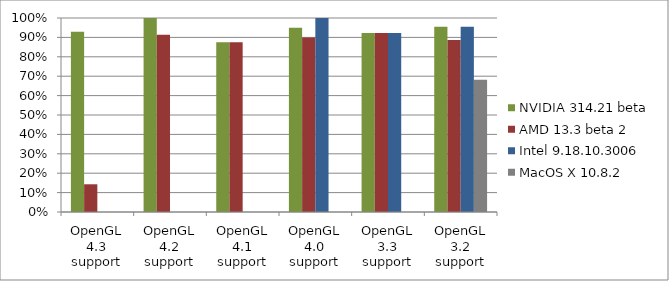
| Category | NVIDIA 314.21 beta | AMD 13.3 beta 2 | Intel 9.18.10.3006 | MacOS X 10.8.2 |
|---|---|---|---|---|
| OpenGL 4.3 support | 0.929 | 0.143 | 0 | 0 |
| OpenGL 4.2 support | 1 | 0.913 | 0 | 0 |
| OpenGL 4.1 support | 0.875 | 0.875 | 0 | 0 |
| OpenGL 4.0 support | 0.95 | 0.9 | 1 | 0 |
| OpenGL 3.3 support | 0.923 | 0.923 | 0.923 | 0 |
| OpenGL 3.2 support | 0.955 | 0.886 | 0.955 | 0.682 |